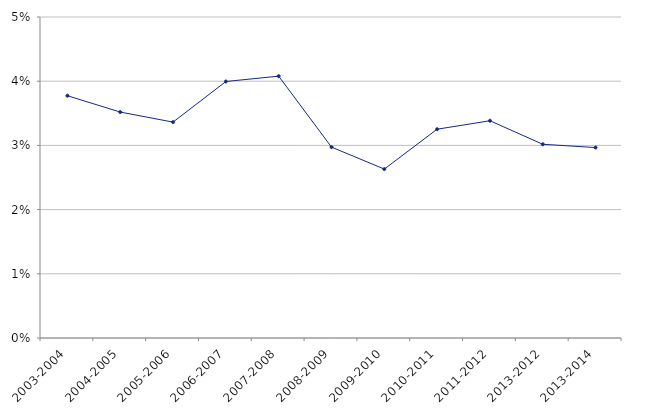
| Category | Series 0 |
|---|---|
| 2003-2004 | 0.038 |
| 2004-2005 | 0.035 |
| 2005-2006 | 0.034 |
| 2006-2007 | 0.04 |
| 2007-2008 | 0.041 |
| 2008-2009 | 0.03 |
| 2009-2010 | 0.026 |
| 2010-2011 | 0.033 |
| 2011-2012 | 0.034 |
| 2013-2012 | 0.03 |
| 2013-2014 | 0.03 |